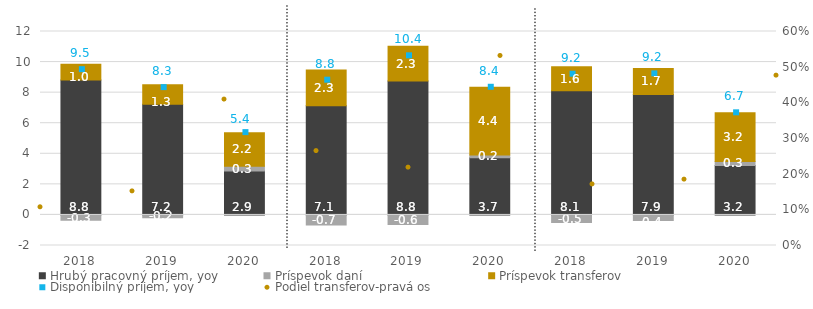
| Category | Hrubý pracovný príjem, yoy | Príspevok daní | Príspevok transferov |
|---|---|---|---|
| 2018.0 | 8.833 | -0.348 | 1.018 |
| 2019.0 | 7.248 | -0.183 | 1.264 |
| 2020.0 | 2.868 | 0.313 | 2.203 |
| 2018.0 | 7.14 | -0.659 | 2.334 |
| 2019.0 | 8.76 | -0.624 | 2.273 |
| 2020.0 | 3.742 | 0.171 | 4.438 |
| 2018.0 | 8.123 | -0.494 | 1.577 |
| 2019.0 | 7.883 | -0.36 | 1.704 |
| 2020.0 | 3.241 | 0.258 | 3.181 |